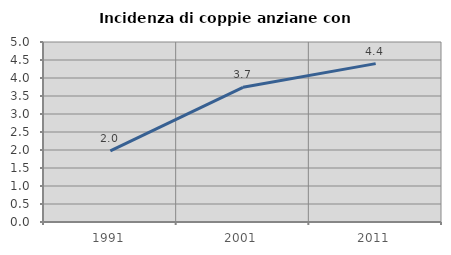
| Category | Incidenza di coppie anziane con figli |
|---|---|
| 1991.0 | 1.977 |
| 2001.0 | 3.741 |
| 2011.0 | 4.4 |